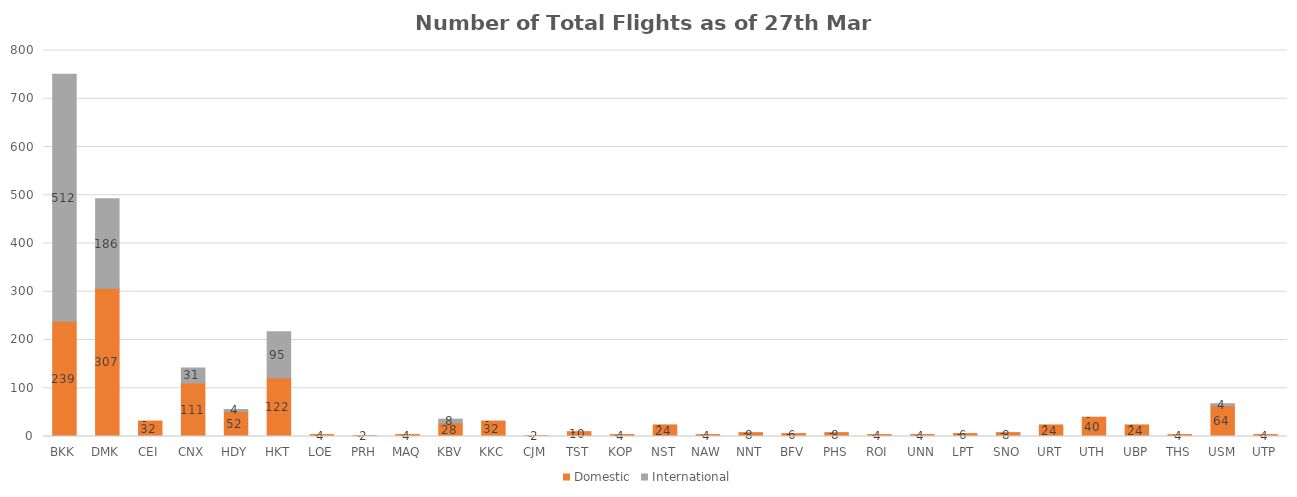
| Category | Domestic | International |
|---|---|---|
| BKK | 239 | 512 |
| DMK | 307 | 186 |
| CEI | 32 | 0 |
| CNX | 111 | 31 |
| HDY | 52 | 4 |
| HKT | 122 | 95 |
| LOE | 4 | 0 |
| PRH | 2 | 0 |
| MAQ | 4 | 0 |
| KBV | 28 | 8 |
| KKC | 32 | 0 |
| CJM | 2 | 0 |
| TST | 10 | 0 |
| KOP | 4 | 0 |
| NST | 24 | 0 |
| NAW | 4 | 0 |
| NNT | 8 | 0 |
| BFV | 6 | 0 |
| PHS | 8 | 0 |
| ROI | 4 | 0 |
| UNN | 4 | 0 |
| LPT | 6 | 0 |
| SNO | 8 | 0 |
| URT | 24 | 0 |
| UTH | 40 | 0 |
| UBP | 24 | 0 |
| THS | 4 | 0 |
| USM | 64 | 4 |
| UTP | 4 | 0 |